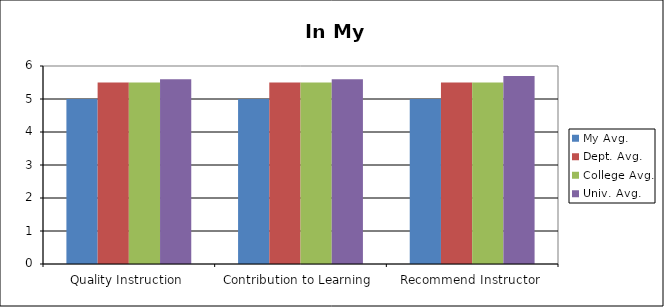
| Category | My Avg. | Dept. Avg. | College Avg. | Univ. Avg. |
|---|---|---|---|---|
| Quality Instruction | 5 | 5.5 | 5.5 | 5.6 |
| Contribution to Learning | 5 | 5.5 | 5.5 | 5.6 |
| Recommend Instructor | 5 | 5.5 | 5.5 | 5.7 |